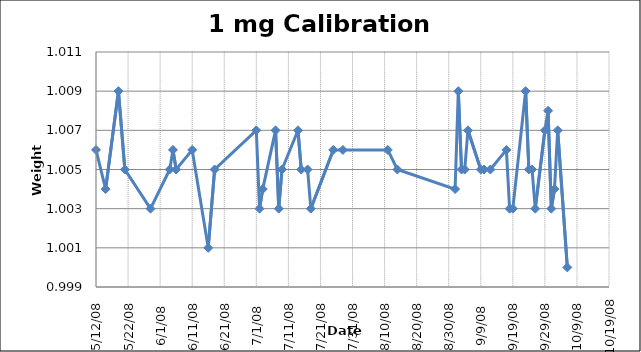
| Category | Series 0 |
|---|---|
| 39580.0 | 1.006 |
| 39583.0 | 1.004 |
| 39587.0 | 1.009 |
| 39589.0 | 1.005 |
| 39597.0 | 1.003 |
| 39603.0 | 1.005 |
| 39604.0 | 1.006 |
| 39605.0 | 1.005 |
| 39610.0 | 1.006 |
| 39615.0 | 1.001 |
| 39617.0 | 1.005 |
| 39630.0 | 1.007 |
| 39631.0 | 1.003 |
| 39632.0 | 1.004 |
| 39636.0 | 1.007 |
| 39637.0 | 1.003 |
| 39638.0 | 1.005 |
| 39643.0 | 1.007 |
| 39644.0 | 1.005 |
| 39646.0 | 1.005 |
| 39647.0 | 1.003 |
| 39654.0 | 1.006 |
| 39657.0 | 1.006 |
| 39671.0 | 1.006 |
| 39674.0 | 1.005 |
| 39692.0 | 1.004 |
| 39693.0 | 1.009 |
| 39694.0 | 1.005 |
| 39695.0 | 1.005 |
| 39696.0 | 1.007 |
| 39700.0 | 1.005 |
| 39701.0 | 1.005 |
| 39703.0 | 1.005 |
| 39708.0 | 1.006 |
| 39709.0 | 1.003 |
| 39710.0 | 1.003 |
| 39714.0 | 1.009 |
| 39715.0 | 1.005 |
| 39716.0 | 1.005 |
| 39717.0 | 1.003 |
| 39720.0 | 1.007 |
| 39721.0 | 1.008 |
| 39722.0 | 1.003 |
| 39723.0 | 1.004 |
| 39724.0 | 1.007 |
| 39727.0 | 1 |